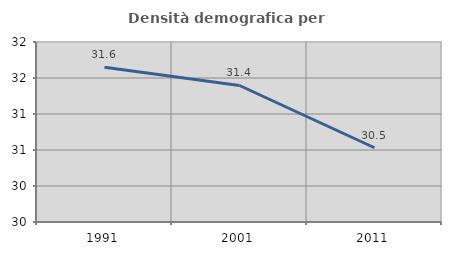
| Category | Densità demografica |
|---|---|
| 1991.0 | 31.649 |
| 2001.0 | 31.396 |
| 2011.0 | 30.531 |